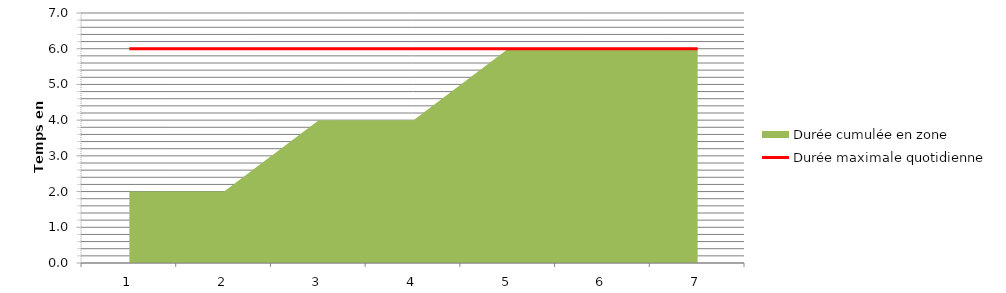
| Category | Durée maximale quotidienne |
|---|---|
| 1.0 | 6 |
| 2.0 | 6 |
| 3.0 | 6 |
| 4.0 | 6 |
| 5.0 | 6 |
| 6.0 | 6 |
| 7.0 | 6 |